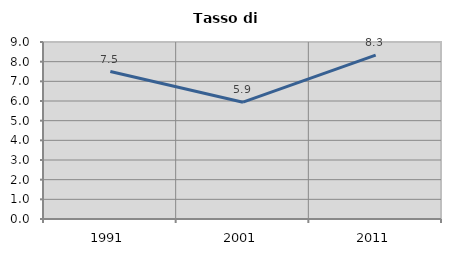
| Category | Tasso di disoccupazione   |
|---|---|
| 1991.0 | 7.5 |
| 2001.0 | 5.941 |
| 2011.0 | 8.333 |